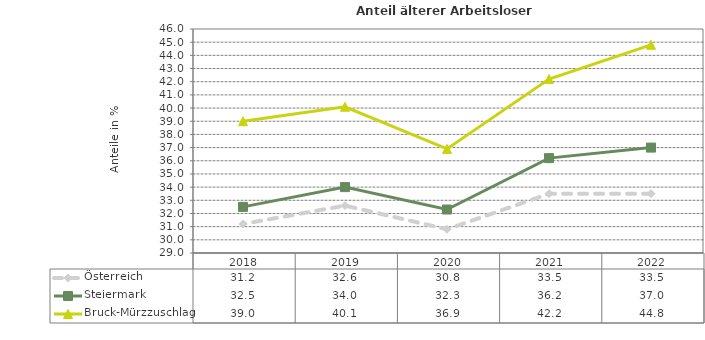
| Category | Österreich | Steiermark | Bruck-Mürzzuschlag |
|---|---|---|---|
| 2022.0 | 33.5 | 37 | 44.8 |
| 2021.0 | 33.5 | 36.2 | 42.2 |
| 2020.0 | 30.8 | 32.3 | 36.9 |
| 2019.0 | 32.6 | 34 | 40.1 |
| 2018.0 | 31.2 | 32.5 | 39 |